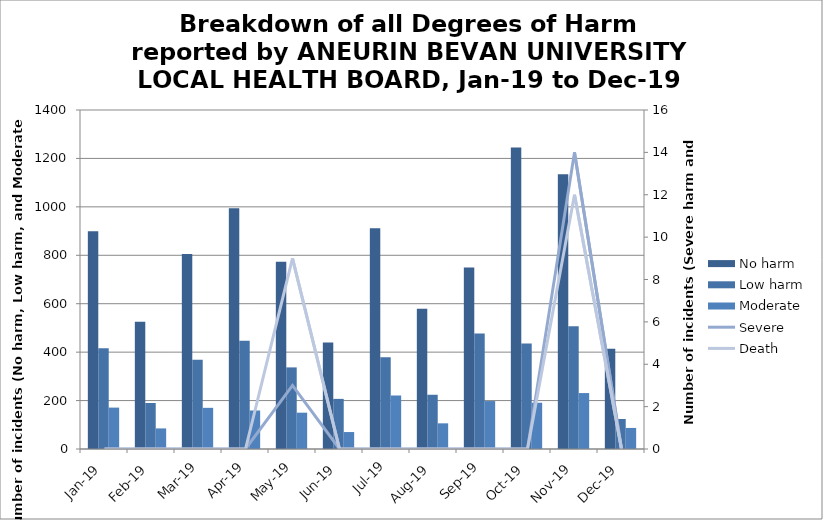
| Category | No harm | Low harm | Moderate |
|---|---|---|---|
| Jan-19 | 899 | 416 | 171 |
| Feb-19 | 526 | 190 | 85 |
| Mar-19 | 805 | 369 | 170 |
| Apr-19 | 994 | 447 | 159 |
| May-19 | 773 | 337 | 150 |
| Jun-19 | 440 | 207 | 70 |
| Jul-19 | 912 | 379 | 221 |
| Aug-19 | 579 | 224 | 106 |
| Sep-19 | 750 | 477 | 198 |
| Oct-19 | 1245 | 436 | 191 |
| Nov-19 | 1135 | 507 | 231 |
| Dec-19 | 414 | 124 | 87 |